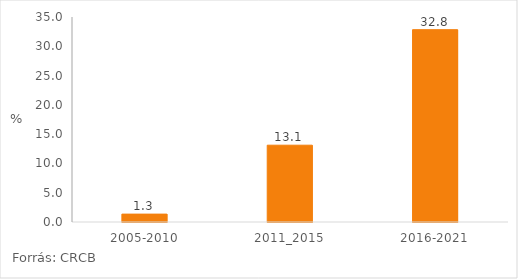
| Category | Series 0 |
|---|---|
| 2005-2010 | 1.345 |
| 2011_2015 | 13.112 |
| 2016-2021 | 32.836 |